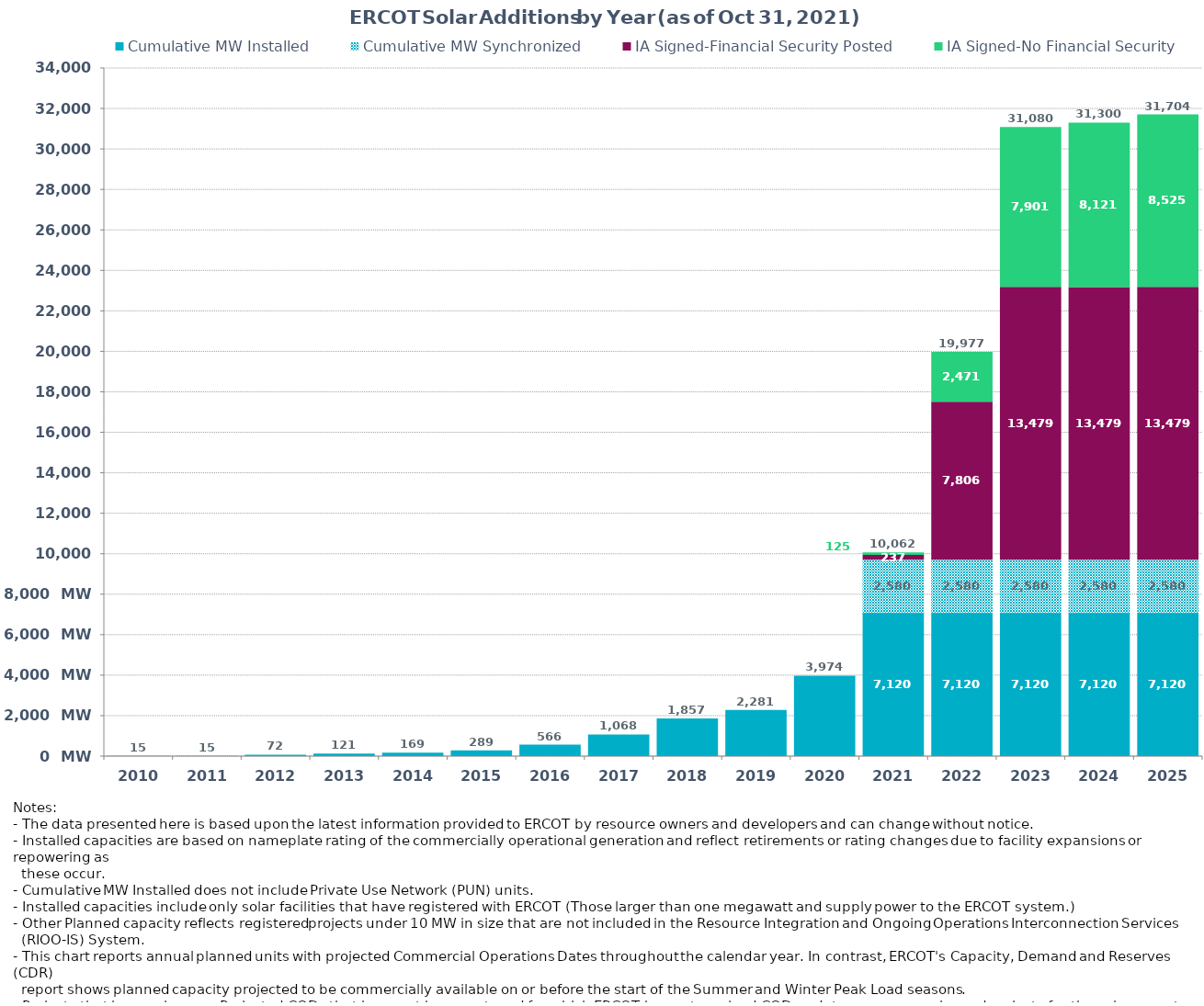
| Category | Cumulative MW Installed | Cumulative MW Synchronized | IA Signed-Financial Security Posted  | IA Signed-No Financial Security  | Other Planned | Cumulative Installed and Planned |
|---|---|---|---|---|---|---|
| 2010.0 | 15 | 0 | 0 | 0 | 0 | 15 |
| 2011.0 | 15 | 0 | 0 | 0 | 0 | 15 |
| 2012.0 | 72.3 | 0 | 0 | 0 | 0 | 72.3 |
| 2013.0 | 121.2 | 0 | 0 | 0 | 0 | 121.2 |
| 2014.0 | 168.7 | 0 | 0 | 0 | 0 | 168.7 |
| 2015.0 | 289.28 | 0 | 0 | 0 | 0 | 289.28 |
| 2016.0 | 565.78 | 0 | 0 | 0 | 0 | 565.78 |
| 2017.0 | 1067.78 | 0 | 0 | 0 | 0 | 1067.78 |
| 2018.0 | 1856.78 | 0 | 0 | 0 | 0 | 1856.78 |
| 2019.0 | 2281.38 | 0 | 0 | 0 | 0 | 2281.38 |
| 2020.0 | 3973.5 | 0 | 0 | 0 | 0 | 3973.5 |
| 2021.0 | 7120.26 | 2579.95 | 237.2 | 125 | 0 | 10062.41 |
| 2022.0 | 7120.26 | 2579.95 | 7806 | 2471.27 | 0 | 19977.48 |
| 2023.0 | 7120.26 | 2579.95 | 13479.32 | 7900.65 | 0 | 31080.18 |
| 2024.0 | 7120.26 | 2579.95 | 13479 | 8120.98 | 0 | 31300.19 |
| 2025.0 | 7120.26 | 2579.95 | 13479.32 | 8524.88 | 0 | 31704.41 |